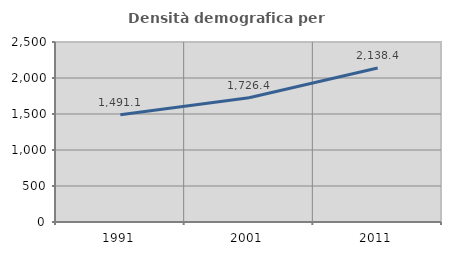
| Category | Densità demografica |
|---|---|
| 1991.0 | 1491.139 |
| 2001.0 | 1726.434 |
| 2011.0 | 2138.446 |